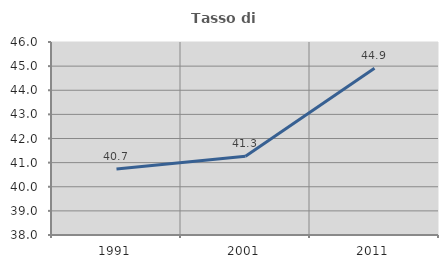
| Category | Tasso di occupazione   |
|---|---|
| 1991.0 | 40.733 |
| 2001.0 | 41.263 |
| 2011.0 | 44.909 |